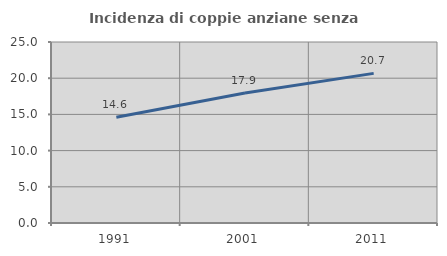
| Category | Incidenza di coppie anziane senza figli  |
|---|---|
| 1991.0 | 14.614 |
| 2001.0 | 17.949 |
| 2011.0 | 20.669 |